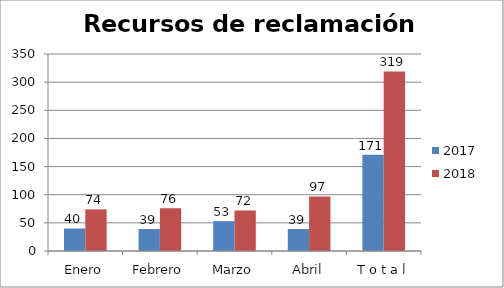
| Category | 2017 | 2018 |
|---|---|---|
| Enero | 40 | 74 |
| Febrero | 39 | 76 |
| Marzo | 53 | 72 |
| Abril | 39 | 97 |
| T o t a l | 171 | 319 |